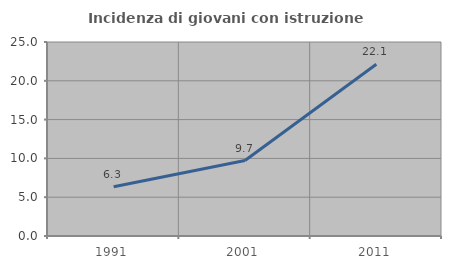
| Category | Incidenza di giovani con istruzione universitaria |
|---|---|
| 1991.0 | 6.349 |
| 2001.0 | 9.722 |
| 2011.0 | 22.131 |